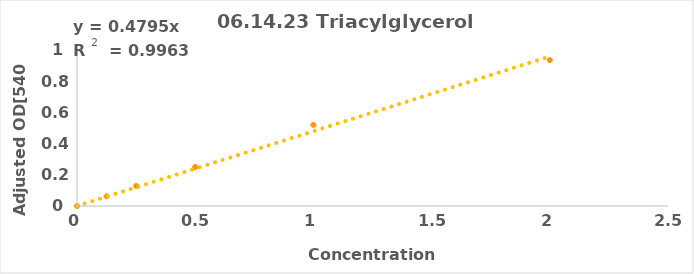
| Category | Series 0 |
|---|---|
| 0.0 | 0 |
| 0.125 | 0.062 |
| 0.25 | 0.129 |
| 0.5 | 0.25 |
| 1.0 | 0.52 |
| 2.0 | 0.935 |